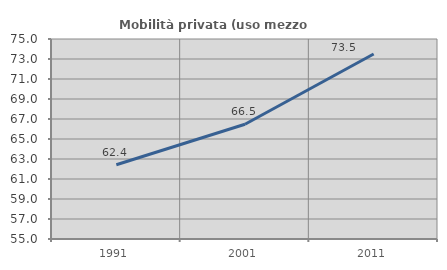
| Category | Mobilità privata (uso mezzo privato) |
|---|---|
| 1991.0 | 62.428 |
| 2001.0 | 66.48 |
| 2011.0 | 73.5 |